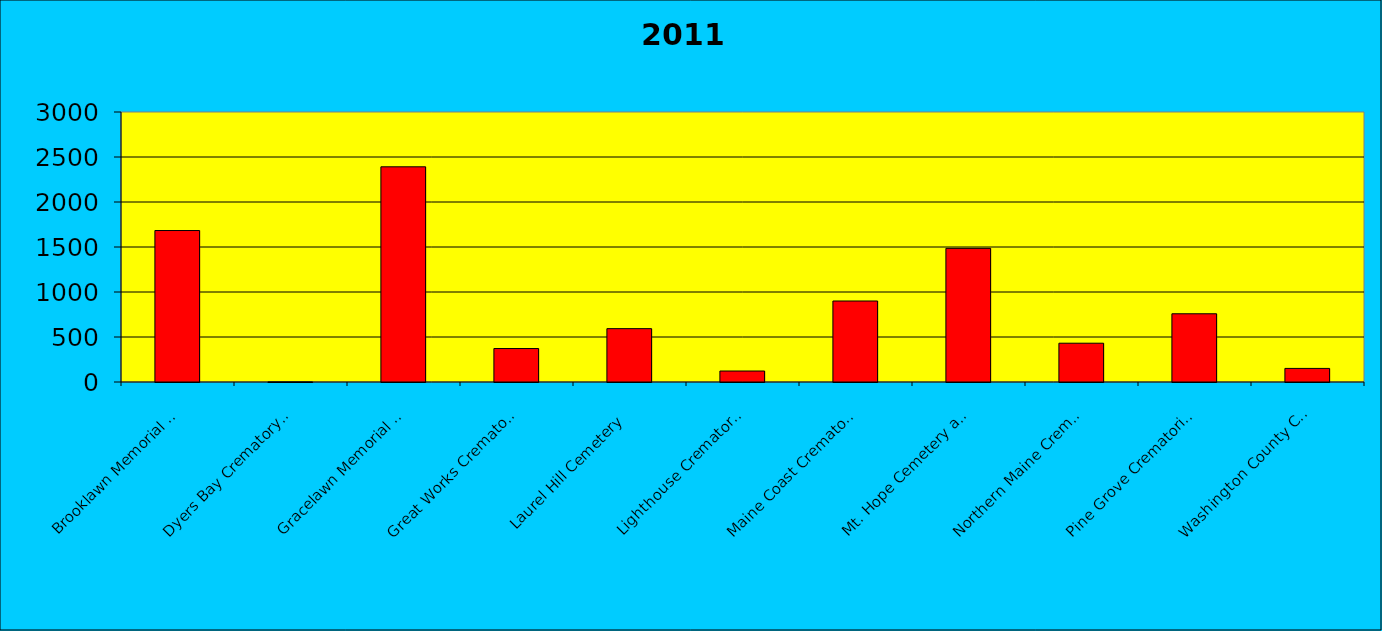
| Category | Series 0 |
|---|---|
| Brooklawn Memorial Park | 1683 |
| Dyers Bay Crematory * | 1 |
| Gracelawn Memorial Park | 2391 |
| Great Works Crematory | 372 |
| Laurel Hill Cemetery | 593 |
| Lighthouse Crematory & Remembrance, Inc. | 122 |
| Maine Coast Crematory** | 900 |
| Mt. Hope Cemetery and Crematory | 1485 |
| Northern Maine Crematory | 431 |
| Pine Grove Crematorium | 758 |
| Washington County Crematorium | 151 |